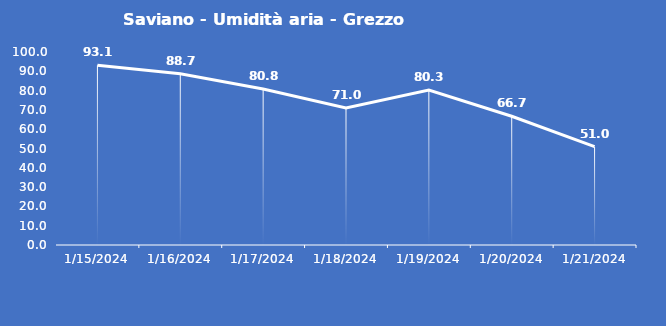
| Category | Saviano - Umidità aria - Grezzo (%) |
|---|---|
| 1/15/24 | 93.1 |
| 1/16/24 | 88.7 |
| 1/17/24 | 80.8 |
| 1/18/24 | 71 |
| 1/19/24 | 80.3 |
| 1/20/24 | 66.7 |
| 1/21/24 | 51 |